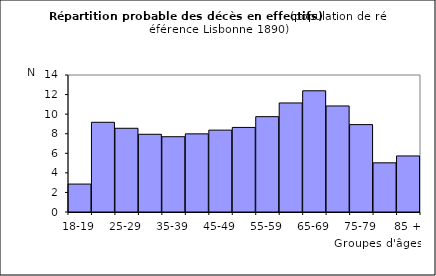
| Category | Series 0 |
|---|---|
| 18-19 | 2.853 |
| 20-24 | 9.168 |
| 25-29 | 8.556 |
| 30-34 | 7.941 |
| 35-39 | 7.694 |
| 40-44 | 7.984 |
| 45-49 | 8.367 |
| 50-54 | 8.642 |
| 55-59 | 9.743 |
| 60-64 | 11.143 |
| 65-69 | 12.388 |
| 70-74 | 10.837 |
| 75-79 | 8.932 |
| 80-84 | 5.024 |
| 85 + | 5.728 |